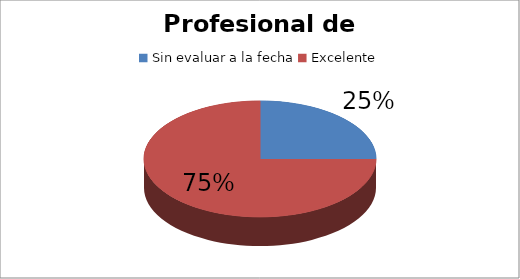
| Category | Cantidad |
|---|---|
| Sin evaluar a la fecha | 1 |
| Excelente | 3 |